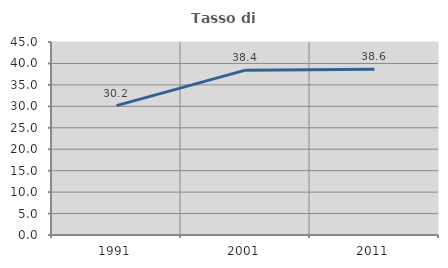
| Category | Tasso di occupazione   |
|---|---|
| 1991.0 | 30.168 |
| 2001.0 | 38.436 |
| 2011.0 | 38.629 |